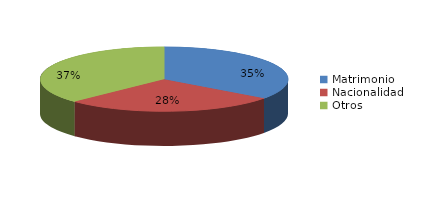
| Category | Series 0 |
|---|---|
| Matrimonio | 2105 |
| Nacionalidad | 1660 |
| Otros | 2233 |